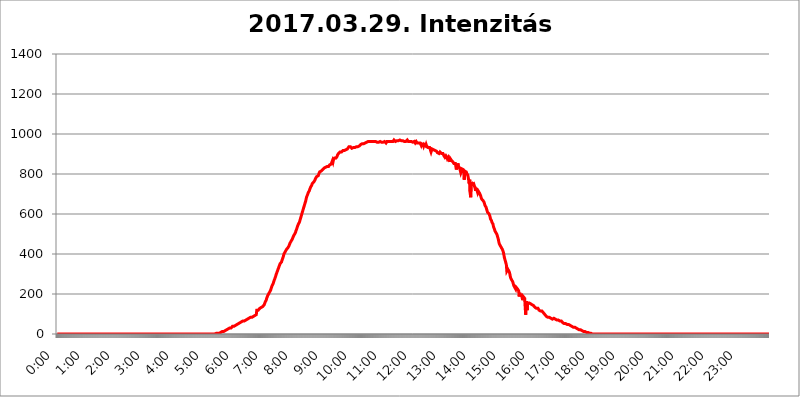
| Category | 2017.03.29. Intenzitás [W/m^2] |
|---|---|
| 0.0 | 0 |
| 0.0006944444444444445 | 0 |
| 0.001388888888888889 | 0 |
| 0.0020833333333333333 | 0 |
| 0.002777777777777778 | 0 |
| 0.003472222222222222 | 0 |
| 0.004166666666666667 | 0 |
| 0.004861111111111111 | 0 |
| 0.005555555555555556 | 0 |
| 0.0062499999999999995 | 0 |
| 0.006944444444444444 | 0 |
| 0.007638888888888889 | 0 |
| 0.008333333333333333 | 0 |
| 0.009027777777777779 | 0 |
| 0.009722222222222222 | 0 |
| 0.010416666666666666 | 0 |
| 0.011111111111111112 | 0 |
| 0.011805555555555555 | 0 |
| 0.012499999999999999 | 0 |
| 0.013194444444444444 | 0 |
| 0.013888888888888888 | 0 |
| 0.014583333333333332 | 0 |
| 0.015277777777777777 | 0 |
| 0.015972222222222224 | 0 |
| 0.016666666666666666 | 0 |
| 0.017361111111111112 | 0 |
| 0.018055555555555557 | 0 |
| 0.01875 | 0 |
| 0.019444444444444445 | 0 |
| 0.02013888888888889 | 0 |
| 0.020833333333333332 | 0 |
| 0.02152777777777778 | 0 |
| 0.022222222222222223 | 0 |
| 0.02291666666666667 | 0 |
| 0.02361111111111111 | 0 |
| 0.024305555555555556 | 0 |
| 0.024999999999999998 | 0 |
| 0.025694444444444447 | 0 |
| 0.02638888888888889 | 0 |
| 0.027083333333333334 | 0 |
| 0.027777777777777776 | 0 |
| 0.02847222222222222 | 0 |
| 0.029166666666666664 | 0 |
| 0.029861111111111113 | 0 |
| 0.030555555555555555 | 0 |
| 0.03125 | 0 |
| 0.03194444444444445 | 0 |
| 0.03263888888888889 | 0 |
| 0.03333333333333333 | 0 |
| 0.034027777777777775 | 0 |
| 0.034722222222222224 | 0 |
| 0.035416666666666666 | 0 |
| 0.036111111111111115 | 0 |
| 0.03680555555555556 | 0 |
| 0.0375 | 0 |
| 0.03819444444444444 | 0 |
| 0.03888888888888889 | 0 |
| 0.03958333333333333 | 0 |
| 0.04027777777777778 | 0 |
| 0.04097222222222222 | 0 |
| 0.041666666666666664 | 0 |
| 0.042361111111111106 | 0 |
| 0.04305555555555556 | 0 |
| 0.043750000000000004 | 0 |
| 0.044444444444444446 | 0 |
| 0.04513888888888889 | 0 |
| 0.04583333333333334 | 0 |
| 0.04652777777777778 | 0 |
| 0.04722222222222222 | 0 |
| 0.04791666666666666 | 0 |
| 0.04861111111111111 | 0 |
| 0.049305555555555554 | 0 |
| 0.049999999999999996 | 0 |
| 0.05069444444444445 | 0 |
| 0.051388888888888894 | 0 |
| 0.052083333333333336 | 0 |
| 0.05277777777777778 | 0 |
| 0.05347222222222222 | 0 |
| 0.05416666666666667 | 0 |
| 0.05486111111111111 | 0 |
| 0.05555555555555555 | 0 |
| 0.05625 | 0 |
| 0.05694444444444444 | 0 |
| 0.057638888888888885 | 0 |
| 0.05833333333333333 | 0 |
| 0.05902777777777778 | 0 |
| 0.059722222222222225 | 0 |
| 0.06041666666666667 | 0 |
| 0.061111111111111116 | 0 |
| 0.06180555555555556 | 0 |
| 0.0625 | 0 |
| 0.06319444444444444 | 0 |
| 0.06388888888888888 | 0 |
| 0.06458333333333334 | 0 |
| 0.06527777777777778 | 0 |
| 0.06597222222222222 | 0 |
| 0.06666666666666667 | 0 |
| 0.06736111111111111 | 0 |
| 0.06805555555555555 | 0 |
| 0.06874999999999999 | 0 |
| 0.06944444444444443 | 0 |
| 0.07013888888888889 | 0 |
| 0.07083333333333333 | 0 |
| 0.07152777777777779 | 0 |
| 0.07222222222222223 | 0 |
| 0.07291666666666667 | 0 |
| 0.07361111111111111 | 0 |
| 0.07430555555555556 | 0 |
| 0.075 | 0 |
| 0.07569444444444444 | 0 |
| 0.0763888888888889 | 0 |
| 0.07708333333333334 | 0 |
| 0.07777777777777778 | 0 |
| 0.07847222222222222 | 0 |
| 0.07916666666666666 | 0 |
| 0.0798611111111111 | 0 |
| 0.08055555555555556 | 0 |
| 0.08125 | 0 |
| 0.08194444444444444 | 0 |
| 0.08263888888888889 | 0 |
| 0.08333333333333333 | 0 |
| 0.08402777777777777 | 0 |
| 0.08472222222222221 | 0 |
| 0.08541666666666665 | 0 |
| 0.08611111111111112 | 0 |
| 0.08680555555555557 | 0 |
| 0.08750000000000001 | 0 |
| 0.08819444444444445 | 0 |
| 0.08888888888888889 | 0 |
| 0.08958333333333333 | 0 |
| 0.09027777777777778 | 0 |
| 0.09097222222222222 | 0 |
| 0.09166666666666667 | 0 |
| 0.09236111111111112 | 0 |
| 0.09305555555555556 | 0 |
| 0.09375 | 0 |
| 0.09444444444444444 | 0 |
| 0.09513888888888888 | 0 |
| 0.09583333333333333 | 0 |
| 0.09652777777777777 | 0 |
| 0.09722222222222222 | 0 |
| 0.09791666666666667 | 0 |
| 0.09861111111111111 | 0 |
| 0.09930555555555555 | 0 |
| 0.09999999999999999 | 0 |
| 0.10069444444444443 | 0 |
| 0.1013888888888889 | 0 |
| 0.10208333333333335 | 0 |
| 0.10277777777777779 | 0 |
| 0.10347222222222223 | 0 |
| 0.10416666666666667 | 0 |
| 0.10486111111111111 | 0 |
| 0.10555555555555556 | 0 |
| 0.10625 | 0 |
| 0.10694444444444444 | 0 |
| 0.1076388888888889 | 0 |
| 0.10833333333333334 | 0 |
| 0.10902777777777778 | 0 |
| 0.10972222222222222 | 0 |
| 0.1111111111111111 | 0 |
| 0.11180555555555556 | 0 |
| 0.11180555555555556 | 0 |
| 0.1125 | 0 |
| 0.11319444444444444 | 0 |
| 0.11388888888888889 | 0 |
| 0.11458333333333333 | 0 |
| 0.11527777777777777 | 0 |
| 0.11597222222222221 | 0 |
| 0.11666666666666665 | 0 |
| 0.1173611111111111 | 0 |
| 0.11805555555555557 | 0 |
| 0.11944444444444445 | 0 |
| 0.12013888888888889 | 0 |
| 0.12083333333333333 | 0 |
| 0.12152777777777778 | 0 |
| 0.12222222222222223 | 0 |
| 0.12291666666666667 | 0 |
| 0.12291666666666667 | 0 |
| 0.12361111111111112 | 0 |
| 0.12430555555555556 | 0 |
| 0.125 | 0 |
| 0.12569444444444444 | 0 |
| 0.12638888888888888 | 0 |
| 0.12708333333333333 | 0 |
| 0.16875 | 0 |
| 0.12847222222222224 | 0 |
| 0.12916666666666668 | 0 |
| 0.12986111111111112 | 0 |
| 0.13055555555555556 | 0 |
| 0.13125 | 0 |
| 0.13194444444444445 | 0 |
| 0.1326388888888889 | 0 |
| 0.13333333333333333 | 0 |
| 0.13402777777777777 | 0 |
| 0.13402777777777777 | 0 |
| 0.13472222222222222 | 0 |
| 0.13541666666666666 | 0 |
| 0.1361111111111111 | 0 |
| 0.13749999999999998 | 0 |
| 0.13819444444444443 | 0 |
| 0.1388888888888889 | 0 |
| 0.13958333333333334 | 0 |
| 0.14027777777777778 | 0 |
| 0.14097222222222222 | 0 |
| 0.14166666666666666 | 0 |
| 0.1423611111111111 | 0 |
| 0.14305555555555557 | 0 |
| 0.14375000000000002 | 0 |
| 0.14444444444444446 | 0 |
| 0.1451388888888889 | 0 |
| 0.1451388888888889 | 0 |
| 0.14652777777777778 | 0 |
| 0.14722222222222223 | 0 |
| 0.14791666666666667 | 0 |
| 0.1486111111111111 | 0 |
| 0.14930555555555555 | 0 |
| 0.15 | 0 |
| 0.15069444444444444 | 0 |
| 0.15138888888888888 | 0 |
| 0.15208333333333332 | 0 |
| 0.15277777777777776 | 0 |
| 0.15347222222222223 | 0 |
| 0.15416666666666667 | 0 |
| 0.15486111111111112 | 0 |
| 0.15555555555555556 | 0 |
| 0.15625 | 0 |
| 0.15694444444444444 | 0 |
| 0.15763888888888888 | 0 |
| 0.15833333333333333 | 0 |
| 0.15902777777777777 | 0 |
| 0.15972222222222224 | 0 |
| 0.16041666666666668 | 0 |
| 0.16111111111111112 | 0 |
| 0.16180555555555556 | 0 |
| 0.1625 | 0 |
| 0.16319444444444445 | 0 |
| 0.1638888888888889 | 0 |
| 0.16458333333333333 | 0 |
| 0.16527777777777777 | 0 |
| 0.16597222222222222 | 0 |
| 0.16666666666666666 | 0 |
| 0.1673611111111111 | 0 |
| 0.16805555555555554 | 0 |
| 0.16874999999999998 | 0 |
| 0.16944444444444443 | 0 |
| 0.17013888888888887 | 0 |
| 0.1708333333333333 | 0 |
| 0.17152777777777775 | 0 |
| 0.17222222222222225 | 0 |
| 0.1729166666666667 | 0 |
| 0.17361111111111113 | 0 |
| 0.17430555555555557 | 0 |
| 0.17500000000000002 | 0 |
| 0.17569444444444446 | 0 |
| 0.1763888888888889 | 0 |
| 0.17708333333333334 | 0 |
| 0.17777777777777778 | 0 |
| 0.17847222222222223 | 0 |
| 0.17916666666666667 | 0 |
| 0.1798611111111111 | 0 |
| 0.18055555555555555 | 0 |
| 0.18125 | 0 |
| 0.18194444444444444 | 0 |
| 0.1826388888888889 | 0 |
| 0.18333333333333335 | 0 |
| 0.1840277777777778 | 0 |
| 0.18472222222222223 | 0 |
| 0.18541666666666667 | 0 |
| 0.18611111111111112 | 0 |
| 0.18680555555555556 | 0 |
| 0.1875 | 0 |
| 0.18819444444444444 | 0 |
| 0.18888888888888888 | 0 |
| 0.18958333333333333 | 0 |
| 0.19027777777777777 | 0 |
| 0.1909722222222222 | 0 |
| 0.19166666666666665 | 0 |
| 0.19236111111111112 | 0 |
| 0.19305555555555554 | 0 |
| 0.19375 | 0 |
| 0.19444444444444445 | 0 |
| 0.1951388888888889 | 0 |
| 0.19583333333333333 | 0 |
| 0.19652777777777777 | 0 |
| 0.19722222222222222 | 0 |
| 0.19791666666666666 | 0 |
| 0.1986111111111111 | 0 |
| 0.19930555555555554 | 0 |
| 0.19999999999999998 | 0 |
| 0.20069444444444443 | 0 |
| 0.20138888888888887 | 0 |
| 0.2020833333333333 | 0 |
| 0.2027777777777778 | 0 |
| 0.2034722222222222 | 0 |
| 0.2041666666666667 | 0 |
| 0.20486111111111113 | 0 |
| 0.20555555555555557 | 0 |
| 0.20625000000000002 | 0 |
| 0.20694444444444446 | 0 |
| 0.2076388888888889 | 0 |
| 0.20833333333333334 | 0 |
| 0.20902777777777778 | 0 |
| 0.20972222222222223 | 0 |
| 0.21041666666666667 | 0 |
| 0.2111111111111111 | 0 |
| 0.21180555555555555 | 0 |
| 0.2125 | 0 |
| 0.21319444444444444 | 0 |
| 0.2138888888888889 | 0 |
| 0.21458333333333335 | 0 |
| 0.2152777777777778 | 0 |
| 0.21597222222222223 | 0 |
| 0.21666666666666667 | 0 |
| 0.21736111111111112 | 0 |
| 0.21805555555555556 | 0 |
| 0.21875 | 0 |
| 0.21944444444444444 | 0 |
| 0.22013888888888888 | 0 |
| 0.22083333333333333 | 0 |
| 0.22152777777777777 | 3.525 |
| 0.2222222222222222 | 3.525 |
| 0.22291666666666665 | 3.525 |
| 0.2236111111111111 | 3.525 |
| 0.22430555555555556 | 3.525 |
| 0.225 | 3.525 |
| 0.22569444444444445 | 3.525 |
| 0.2263888888888889 | 3.525 |
| 0.22708333333333333 | 3.525 |
| 0.22777777777777777 | 7.887 |
| 0.22847222222222222 | 7.887 |
| 0.22916666666666666 | 7.887 |
| 0.2298611111111111 | 7.887 |
| 0.23055555555555554 | 7.887 |
| 0.23124999999999998 | 12.257 |
| 0.23194444444444443 | 12.257 |
| 0.23263888888888887 | 12.257 |
| 0.2333333333333333 | 12.257 |
| 0.2340277777777778 | 16.636 |
| 0.2347222222222222 | 16.636 |
| 0.2354166666666667 | 16.636 |
| 0.23611111111111113 | 21.024 |
| 0.23680555555555557 | 21.024 |
| 0.23750000000000002 | 21.024 |
| 0.23819444444444446 | 21.024 |
| 0.2388888888888889 | 25.419 |
| 0.23958333333333334 | 25.419 |
| 0.24027777777777778 | 25.419 |
| 0.24097222222222223 | 29.823 |
| 0.24166666666666667 | 29.823 |
| 0.2423611111111111 | 29.823 |
| 0.24305555555555555 | 29.823 |
| 0.24375 | 29.823 |
| 0.24444444444444446 | 34.234 |
| 0.24513888888888888 | 34.234 |
| 0.24583333333333335 | 38.653 |
| 0.2465277777777778 | 38.653 |
| 0.24722222222222223 | 38.653 |
| 0.24791666666666667 | 38.653 |
| 0.24861111111111112 | 38.653 |
| 0.24930555555555556 | 43.079 |
| 0.25 | 43.079 |
| 0.25069444444444444 | 43.079 |
| 0.2513888888888889 | 47.511 |
| 0.2520833333333333 | 47.511 |
| 0.25277777777777777 | 47.511 |
| 0.2534722222222222 | 47.511 |
| 0.25416666666666665 | 51.951 |
| 0.2548611111111111 | 51.951 |
| 0.2555555555555556 | 51.951 |
| 0.25625000000000003 | 56.398 |
| 0.2569444444444445 | 56.398 |
| 0.2576388888888889 | 56.398 |
| 0.25833333333333336 | 60.85 |
| 0.2590277777777778 | 60.85 |
| 0.25972222222222224 | 60.85 |
| 0.2604166666666667 | 65.31 |
| 0.2611111111111111 | 65.31 |
| 0.26180555555555557 | 65.31 |
| 0.2625 | 65.31 |
| 0.26319444444444445 | 69.775 |
| 0.2638888888888889 | 69.775 |
| 0.26458333333333334 | 69.775 |
| 0.2652777777777778 | 69.775 |
| 0.2659722222222222 | 74.246 |
| 0.26666666666666666 | 74.246 |
| 0.2673611111111111 | 74.246 |
| 0.26805555555555555 | 74.246 |
| 0.26875 | 78.722 |
| 0.26944444444444443 | 78.722 |
| 0.2701388888888889 | 83.205 |
| 0.2708333333333333 | 83.205 |
| 0.27152777777777776 | 83.205 |
| 0.2722222222222222 | 83.205 |
| 0.27291666666666664 | 83.205 |
| 0.2736111111111111 | 87.692 |
| 0.2743055555555555 | 87.692 |
| 0.27499999999999997 | 87.692 |
| 0.27569444444444446 | 87.692 |
| 0.27638888888888885 | 92.184 |
| 0.27708333333333335 | 92.184 |
| 0.2777777777777778 | 92.184 |
| 0.27847222222222223 | 92.184 |
| 0.2791666666666667 | 96.682 |
| 0.2798611111111111 | 119.235 |
| 0.28055555555555556 | 119.235 |
| 0.28125 | 119.235 |
| 0.28194444444444444 | 119.235 |
| 0.2826388888888889 | 123.758 |
| 0.2833333333333333 | 123.758 |
| 0.28402777777777777 | 128.284 |
| 0.2847222222222222 | 128.284 |
| 0.28541666666666665 | 128.284 |
| 0.28611111111111115 | 132.814 |
| 0.28680555555555554 | 132.814 |
| 0.28750000000000003 | 132.814 |
| 0.2881944444444445 | 137.347 |
| 0.2888888888888889 | 141.884 |
| 0.28958333333333336 | 141.884 |
| 0.2902777777777778 | 146.423 |
| 0.29097222222222224 | 150.964 |
| 0.2916666666666667 | 160.056 |
| 0.2923611111111111 | 164.605 |
| 0.29305555555555557 | 169.156 |
| 0.29375 | 178.264 |
| 0.29444444444444445 | 182.82 |
| 0.2951388888888889 | 191.937 |
| 0.29583333333333334 | 196.497 |
| 0.2965277777777778 | 201.058 |
| 0.2972222222222222 | 201.058 |
| 0.29791666666666666 | 210.182 |
| 0.2986111111111111 | 214.746 |
| 0.29930555555555555 | 219.309 |
| 0.3 | 228.436 |
| 0.30069444444444443 | 233 |
| 0.3013888888888889 | 242.127 |
| 0.3020833333333333 | 246.689 |
| 0.30277777777777776 | 251.251 |
| 0.3034722222222222 | 260.373 |
| 0.30416666666666664 | 264.932 |
| 0.3048611111111111 | 274.047 |
| 0.3055555555555555 | 278.603 |
| 0.30624999999999997 | 287.709 |
| 0.3069444444444444 | 296.808 |
| 0.3076388888888889 | 301.354 |
| 0.30833333333333335 | 310.44 |
| 0.3090277777777778 | 314.98 |
| 0.30972222222222223 | 324.052 |
| 0.3104166666666667 | 328.584 |
| 0.3111111111111111 | 337.639 |
| 0.31180555555555556 | 342.162 |
| 0.3125 | 351.198 |
| 0.31319444444444444 | 355.712 |
| 0.3138888888888889 | 355.712 |
| 0.3145833333333333 | 360.221 |
| 0.31527777777777777 | 369.23 |
| 0.3159722222222222 | 373.729 |
| 0.31666666666666665 | 382.715 |
| 0.31736111111111115 | 391.685 |
| 0.31805555555555554 | 400.638 |
| 0.31875000000000003 | 400.638 |
| 0.3194444444444445 | 409.574 |
| 0.3201388888888889 | 414.035 |
| 0.32083333333333336 | 414.035 |
| 0.3215277777777778 | 422.943 |
| 0.32222222222222224 | 422.943 |
| 0.3229166666666667 | 427.39 |
| 0.3236111111111111 | 431.833 |
| 0.32430555555555557 | 431.833 |
| 0.325 | 440.702 |
| 0.32569444444444445 | 445.129 |
| 0.3263888888888889 | 453.968 |
| 0.32708333333333334 | 458.38 |
| 0.3277777777777778 | 462.786 |
| 0.3284722222222222 | 462.786 |
| 0.32916666666666666 | 467.187 |
| 0.3298611111111111 | 475.972 |
| 0.33055555555555555 | 480.356 |
| 0.33125 | 489.108 |
| 0.33194444444444443 | 493.475 |
| 0.3326388888888889 | 497.836 |
| 0.3333333333333333 | 502.192 |
| 0.3340277777777778 | 506.542 |
| 0.3347222222222222 | 515.223 |
| 0.3354166666666667 | 519.555 |
| 0.3361111111111111 | 528.2 |
| 0.3368055555555556 | 536.82 |
| 0.33749999999999997 | 541.121 |
| 0.33819444444444446 | 549.704 |
| 0.33888888888888885 | 553.986 |
| 0.33958333333333335 | 558.261 |
| 0.34027777777777773 | 566.793 |
| 0.34097222222222223 | 575.299 |
| 0.3416666666666666 | 583.779 |
| 0.3423611111111111 | 592.233 |
| 0.3430555555555555 | 600.661 |
| 0.34375 | 609.062 |
| 0.3444444444444445 | 617.436 |
| 0.3451388888888889 | 625.784 |
| 0.3458333333333334 | 634.105 |
| 0.34652777777777777 | 642.4 |
| 0.34722222222222227 | 650.667 |
| 0.34791666666666665 | 658.909 |
| 0.34861111111111115 | 667.123 |
| 0.34930555555555554 | 679.395 |
| 0.35000000000000003 | 687.544 |
| 0.3506944444444444 | 691.608 |
| 0.3513888888888889 | 699.717 |
| 0.3520833333333333 | 707.8 |
| 0.3527777777777778 | 711.832 |
| 0.3534722222222222 | 715.858 |
| 0.3541666666666667 | 723.889 |
| 0.3548611111111111 | 727.896 |
| 0.35555555555555557 | 735.89 |
| 0.35625 | 735.89 |
| 0.35694444444444445 | 743.859 |
| 0.3576388888888889 | 751.803 |
| 0.35833333333333334 | 755.766 |
| 0.3590277777777778 | 755.766 |
| 0.3597222222222222 | 759.723 |
| 0.36041666666666666 | 763.674 |
| 0.3611111111111111 | 767.62 |
| 0.36180555555555555 | 771.559 |
| 0.3625 | 779.42 |
| 0.36319444444444443 | 783.342 |
| 0.3638888888888889 | 787.258 |
| 0.3645833333333333 | 791.169 |
| 0.3652777777777778 | 787.258 |
| 0.3659722222222222 | 791.169 |
| 0.3666666666666667 | 798.974 |
| 0.3673611111111111 | 802.868 |
| 0.3680555555555556 | 810.641 |
| 0.36874999999999997 | 806.757 |
| 0.36944444444444446 | 814.519 |
| 0.37013888888888885 | 814.519 |
| 0.37083333333333335 | 818.392 |
| 0.37152777777777773 | 818.392 |
| 0.37222222222222223 | 822.26 |
| 0.3729166666666666 | 826.123 |
| 0.3736111111111111 | 826.123 |
| 0.3743055555555555 | 829.981 |
| 0.375 | 833.834 |
| 0.3756944444444445 | 833.834 |
| 0.3763888888888889 | 833.834 |
| 0.3770833333333334 | 833.834 |
| 0.37777777777777777 | 837.682 |
| 0.37847222222222227 | 837.682 |
| 0.37916666666666665 | 841.526 |
| 0.37986111111111115 | 837.682 |
| 0.38055555555555554 | 837.682 |
| 0.38125000000000003 | 837.682 |
| 0.3819444444444444 | 845.365 |
| 0.3826388888888889 | 845.365 |
| 0.3833333333333333 | 845.365 |
| 0.3840277777777778 | 849.199 |
| 0.3847222222222222 | 853.029 |
| 0.3854166666666667 | 853.029 |
| 0.3861111111111111 | 868.305 |
| 0.38680555555555557 | 860.676 |
| 0.3875 | 872.114 |
| 0.38819444444444445 | 875.918 |
| 0.3888888888888889 | 879.719 |
| 0.38958333333333334 | 875.918 |
| 0.3902777777777778 | 883.516 |
| 0.3909722222222222 | 879.719 |
| 0.39166666666666666 | 875.918 |
| 0.3923611111111111 | 887.309 |
| 0.39305555555555555 | 894.885 |
| 0.39375 | 898.668 |
| 0.39444444444444443 | 902.447 |
| 0.3951388888888889 | 902.447 |
| 0.3958333333333333 | 906.223 |
| 0.3965277777777778 | 909.996 |
| 0.3972222222222222 | 909.996 |
| 0.3979166666666667 | 909.996 |
| 0.3986111111111111 | 909.996 |
| 0.3993055555555556 | 909.996 |
| 0.39999999999999997 | 913.766 |
| 0.40069444444444446 | 917.534 |
| 0.40138888888888885 | 917.534 |
| 0.40208333333333335 | 917.534 |
| 0.40277777777777773 | 917.534 |
| 0.40347222222222223 | 917.534 |
| 0.4041666666666666 | 913.766 |
| 0.4048611111111111 | 921.298 |
| 0.4055555555555555 | 917.534 |
| 0.40625 | 925.06 |
| 0.4069444444444445 | 925.06 |
| 0.4076388888888889 | 925.06 |
| 0.4083333333333334 | 925.06 |
| 0.40902777777777777 | 936.33 |
| 0.40972222222222227 | 936.33 |
| 0.41041666666666665 | 936.33 |
| 0.41111111111111115 | 936.33 |
| 0.41180555555555554 | 932.576 |
| 0.41250000000000003 | 932.576 |
| 0.4131944444444444 | 928.819 |
| 0.4138888888888889 | 928.819 |
| 0.4145833333333333 | 932.576 |
| 0.4152777777777778 | 932.576 |
| 0.4159722222222222 | 932.576 |
| 0.4166666666666667 | 932.576 |
| 0.4173611111111111 | 932.576 |
| 0.41805555555555557 | 932.576 |
| 0.41875 | 932.576 |
| 0.41944444444444445 | 936.33 |
| 0.4201388888888889 | 936.33 |
| 0.42083333333333334 | 936.33 |
| 0.4215277777777778 | 936.33 |
| 0.4222222222222222 | 940.082 |
| 0.42291666666666666 | 940.082 |
| 0.4236111111111111 | 940.082 |
| 0.42430555555555555 | 943.832 |
| 0.425 | 943.832 |
| 0.42569444444444443 | 947.58 |
| 0.4263888888888889 | 947.58 |
| 0.4270833333333333 | 951.327 |
| 0.4277777777777778 | 951.327 |
| 0.4284722222222222 | 947.58 |
| 0.4291666666666667 | 951.327 |
| 0.4298611111111111 | 951.327 |
| 0.4305555555555556 | 955.071 |
| 0.43124999999999997 | 955.071 |
| 0.43194444444444446 | 955.071 |
| 0.43263888888888885 | 958.814 |
| 0.43333333333333335 | 955.071 |
| 0.43402777777777773 | 958.814 |
| 0.43472222222222223 | 955.071 |
| 0.4354166666666666 | 958.814 |
| 0.4361111111111111 | 962.555 |
| 0.4368055555555555 | 962.555 |
| 0.4375 | 962.555 |
| 0.4381944444444445 | 962.555 |
| 0.4388888888888889 | 962.555 |
| 0.4395833333333334 | 962.555 |
| 0.44027777777777777 | 962.555 |
| 0.44097222222222227 | 962.555 |
| 0.44166666666666665 | 962.555 |
| 0.44236111111111115 | 962.555 |
| 0.44305555555555554 | 966.295 |
| 0.44375000000000003 | 962.555 |
| 0.4444444444444444 | 962.555 |
| 0.4451388888888889 | 962.555 |
| 0.4458333333333333 | 962.555 |
| 0.4465277777777778 | 962.555 |
| 0.4472222222222222 | 962.555 |
| 0.4479166666666667 | 962.555 |
| 0.4486111111111111 | 958.814 |
| 0.44930555555555557 | 962.555 |
| 0.45 | 962.555 |
| 0.45069444444444445 | 958.814 |
| 0.4513888888888889 | 962.555 |
| 0.45208333333333334 | 962.555 |
| 0.4527777777777778 | 962.555 |
| 0.4534722222222222 | 962.555 |
| 0.45416666666666666 | 958.814 |
| 0.4548611111111111 | 958.814 |
| 0.45555555555555555 | 962.555 |
| 0.45625 | 962.555 |
| 0.45694444444444443 | 958.814 |
| 0.4576388888888889 | 958.814 |
| 0.4583333333333333 | 958.814 |
| 0.4590277777777778 | 962.555 |
| 0.4597222222222222 | 958.814 |
| 0.4604166666666667 | 958.814 |
| 0.4611111111111111 | 955.071 |
| 0.4618055555555556 | 958.814 |
| 0.46249999999999997 | 962.555 |
| 0.46319444444444446 | 962.555 |
| 0.46388888888888885 | 962.555 |
| 0.46458333333333335 | 962.555 |
| 0.46527777777777773 | 962.555 |
| 0.46597222222222223 | 962.555 |
| 0.4666666666666666 | 962.555 |
| 0.4673611111111111 | 958.814 |
| 0.4680555555555555 | 966.295 |
| 0.46875 | 962.555 |
| 0.4694444444444445 | 966.295 |
| 0.4701388888888889 | 962.555 |
| 0.4708333333333334 | 962.555 |
| 0.47152777777777777 | 966.295 |
| 0.47222222222222227 | 970.034 |
| 0.47291666666666665 | 970.034 |
| 0.47361111111111115 | 966.295 |
| 0.47430555555555554 | 962.555 |
| 0.47500000000000003 | 966.295 |
| 0.4756944444444444 | 962.555 |
| 0.4763888888888889 | 966.295 |
| 0.4770833333333333 | 966.295 |
| 0.4777777777777778 | 966.295 |
| 0.4784722222222222 | 966.295 |
| 0.4791666666666667 | 966.295 |
| 0.4798611111111111 | 970.034 |
| 0.48055555555555557 | 970.034 |
| 0.48125 | 966.295 |
| 0.48194444444444445 | 966.295 |
| 0.4826388888888889 | 966.295 |
| 0.48333333333333334 | 966.295 |
| 0.4840277777777778 | 962.555 |
| 0.4847222222222222 | 966.295 |
| 0.48541666666666666 | 966.295 |
| 0.4861111111111111 | 966.295 |
| 0.48680555555555555 | 962.555 |
| 0.4875 | 962.555 |
| 0.48819444444444443 | 958.814 |
| 0.4888888888888889 | 962.555 |
| 0.4895833333333333 | 962.555 |
| 0.4902777777777778 | 962.555 |
| 0.4909722222222222 | 970.034 |
| 0.4916666666666667 | 970.034 |
| 0.4923611111111111 | 962.555 |
| 0.4930555555555556 | 962.555 |
| 0.49374999999999997 | 962.555 |
| 0.49444444444444446 | 962.555 |
| 0.49513888888888885 | 966.295 |
| 0.49583333333333335 | 962.555 |
| 0.49652777777777773 | 962.555 |
| 0.49722222222222223 | 962.555 |
| 0.4979166666666666 | 958.814 |
| 0.4986111111111111 | 958.814 |
| 0.4993055555555555 | 962.555 |
| 0.5 | 962.555 |
| 0.5006944444444444 | 962.555 |
| 0.5013888888888889 | 958.814 |
| 0.5020833333333333 | 955.071 |
| 0.5027777777777778 | 958.814 |
| 0.5034722222222222 | 962.555 |
| 0.5041666666666667 | 958.814 |
| 0.5048611111111111 | 955.071 |
| 0.5055555555555555 | 951.327 |
| 0.50625 | 955.071 |
| 0.5069444444444444 | 955.071 |
| 0.5076388888888889 | 951.327 |
| 0.5083333333333333 | 951.327 |
| 0.5090277777777777 | 955.071 |
| 0.5097222222222222 | 951.327 |
| 0.5104166666666666 | 943.832 |
| 0.5111111111111112 | 951.327 |
| 0.5118055555555555 | 947.58 |
| 0.5125000000000001 | 947.58 |
| 0.5131944444444444 | 947.58 |
| 0.513888888888889 | 940.082 |
| 0.5145833333333333 | 947.58 |
| 0.5152777777777778 | 947.58 |
| 0.5159722222222222 | 943.832 |
| 0.5166666666666667 | 940.082 |
| 0.517361111111111 | 947.58 |
| 0.5180555555555556 | 940.082 |
| 0.5187499999999999 | 940.082 |
| 0.5194444444444445 | 940.082 |
| 0.5201388888888888 | 932.576 |
| 0.5208333333333334 | 932.576 |
| 0.5215277777777778 | 936.33 |
| 0.5222222222222223 | 932.576 |
| 0.5229166666666667 | 932.576 |
| 0.5236111111111111 | 932.576 |
| 0.5243055555555556 | 909.996 |
| 0.525 | 917.534 |
| 0.5256944444444445 | 925.06 |
| 0.5263888888888889 | 925.06 |
| 0.5270833333333333 | 925.06 |
| 0.5277777777777778 | 921.298 |
| 0.5284722222222222 | 921.298 |
| 0.5291666666666667 | 917.534 |
| 0.5298611111111111 | 917.534 |
| 0.5305555555555556 | 917.534 |
| 0.53125 | 913.766 |
| 0.5319444444444444 | 913.766 |
| 0.5326388888888889 | 909.996 |
| 0.5333333333333333 | 906.223 |
| 0.5340277777777778 | 909.996 |
| 0.5347222222222222 | 909.996 |
| 0.5354166666666667 | 902.447 |
| 0.5361111111111111 | 906.223 |
| 0.5368055555555555 | 909.996 |
| 0.5375 | 909.996 |
| 0.5381944444444444 | 906.223 |
| 0.5388888888888889 | 902.447 |
| 0.5395833333333333 | 902.447 |
| 0.5402777777777777 | 898.668 |
| 0.5409722222222222 | 902.447 |
| 0.5416666666666666 | 898.668 |
| 0.5423611111111112 | 891.099 |
| 0.5430555555555555 | 887.309 |
| 0.5437500000000001 | 883.516 |
| 0.5444444444444444 | 883.516 |
| 0.545138888888889 | 891.099 |
| 0.5458333333333333 | 887.309 |
| 0.5465277777777778 | 883.516 |
| 0.5472222222222222 | 875.918 |
| 0.5479166666666667 | 872.114 |
| 0.548611111111111 | 883.516 |
| 0.5493055555555556 | 875.918 |
| 0.5499999999999999 | 868.305 |
| 0.5506944444444445 | 860.676 |
| 0.5513888888888888 | 875.918 |
| 0.5520833333333334 | 872.114 |
| 0.5527777777777778 | 868.305 |
| 0.5534722222222223 | 868.305 |
| 0.5541666666666667 | 864.493 |
| 0.5548611111111111 | 860.676 |
| 0.5555555555555556 | 856.855 |
| 0.55625 | 853.029 |
| 0.5569444444444445 | 849.199 |
| 0.5576388888888889 | 849.199 |
| 0.5583333333333333 | 853.029 |
| 0.5590277777777778 | 853.029 |
| 0.5597222222222222 | 822.26 |
| 0.5604166666666667 | 833.834 |
| 0.5611111111111111 | 841.526 |
| 0.5618055555555556 | 853.029 |
| 0.5625 | 841.526 |
| 0.5631944444444444 | 837.682 |
| 0.5638888888888889 | 837.682 |
| 0.5645833333333333 | 826.123 |
| 0.5652777777777778 | 826.123 |
| 0.5659722222222222 | 806.757 |
| 0.5666666666666667 | 814.519 |
| 0.5673611111111111 | 826.123 |
| 0.5680555555555555 | 826.123 |
| 0.56875 | 826.123 |
| 0.5694444444444444 | 822.26 |
| 0.5701388888888889 | 814.519 |
| 0.5708333333333333 | 771.559 |
| 0.5715277777777777 | 814.519 |
| 0.5722222222222222 | 814.519 |
| 0.5729166666666666 | 814.519 |
| 0.5736111111111112 | 810.641 |
| 0.5743055555555555 | 802.868 |
| 0.5750000000000001 | 798.974 |
| 0.5756944444444444 | 795.074 |
| 0.576388888888889 | 783.342 |
| 0.5770833333333333 | 779.42 |
| 0.5777777777777778 | 751.803 |
| 0.5784722222222222 | 771.559 |
| 0.5791666666666667 | 703.762 |
| 0.579861111111111 | 683.473 |
| 0.5805555555555556 | 759.723 |
| 0.5812499999999999 | 755.766 |
| 0.5819444444444445 | 747.834 |
| 0.5826388888888888 | 751.803 |
| 0.5833333333333334 | 747.834 |
| 0.5840277777777778 | 751.803 |
| 0.5847222222222223 | 751.803 |
| 0.5854166666666667 | 735.89 |
| 0.5861111111111111 | 727.896 |
| 0.5868055555555556 | 715.858 |
| 0.5875 | 723.889 |
| 0.5881944444444445 | 719.877 |
| 0.5888888888888889 | 715.858 |
| 0.5895833333333333 | 707.8 |
| 0.5902777777777778 | 715.858 |
| 0.5909722222222222 | 715.858 |
| 0.5916666666666667 | 711.832 |
| 0.5923611111111111 | 703.762 |
| 0.5930555555555556 | 699.717 |
| 0.59375 | 691.608 |
| 0.5944444444444444 | 683.473 |
| 0.5951388888888889 | 675.311 |
| 0.5958333333333333 | 675.311 |
| 0.5965277777777778 | 671.22 |
| 0.5972222222222222 | 667.123 |
| 0.5979166666666667 | 663.019 |
| 0.5986111111111111 | 658.909 |
| 0.5993055555555555 | 650.667 |
| 0.6 | 642.4 |
| 0.6006944444444444 | 638.256 |
| 0.6013888888888889 | 634.105 |
| 0.6020833333333333 | 625.784 |
| 0.6027777777777777 | 621.613 |
| 0.6034722222222222 | 609.062 |
| 0.6041666666666666 | 604.864 |
| 0.6048611111111112 | 604.864 |
| 0.6055555555555555 | 600.661 |
| 0.6062500000000001 | 596.45 |
| 0.6069444444444444 | 588.009 |
| 0.607638888888889 | 575.299 |
| 0.6083333333333333 | 571.049 |
| 0.6090277777777778 | 566.793 |
| 0.6097222222222222 | 558.261 |
| 0.6104166666666667 | 558.261 |
| 0.611111111111111 | 549.704 |
| 0.6118055555555556 | 536.82 |
| 0.6124999999999999 | 532.513 |
| 0.6131944444444445 | 523.88 |
| 0.6138888888888888 | 515.223 |
| 0.6145833333333334 | 510.885 |
| 0.6152777777777778 | 506.542 |
| 0.6159722222222223 | 502.192 |
| 0.6166666666666667 | 497.836 |
| 0.6173611111111111 | 489.108 |
| 0.6180555555555556 | 480.356 |
| 0.61875 | 471.582 |
| 0.6194444444444445 | 458.38 |
| 0.6201388888888889 | 449.551 |
| 0.6208333333333333 | 445.129 |
| 0.6215277777777778 | 440.702 |
| 0.6222222222222222 | 436.27 |
| 0.6229166666666667 | 431.833 |
| 0.6236111111111111 | 427.39 |
| 0.6243055555555556 | 422.943 |
| 0.625 | 418.492 |
| 0.6256944444444444 | 409.574 |
| 0.6263888888888889 | 396.164 |
| 0.6270833333333333 | 382.715 |
| 0.6277777777777778 | 373.729 |
| 0.6284722222222222 | 364.728 |
| 0.6291666666666667 | 355.712 |
| 0.6298611111111111 | 346.682 |
| 0.6305555555555555 | 314.98 |
| 0.63125 | 319.517 |
| 0.6319444444444444 | 324.052 |
| 0.6326388888888889 | 319.517 |
| 0.6333333333333333 | 319.517 |
| 0.6340277777777777 | 310.44 |
| 0.6347222222222222 | 301.354 |
| 0.6354166666666666 | 287.709 |
| 0.6361111111111112 | 278.603 |
| 0.6368055555555555 | 274.047 |
| 0.6375000000000001 | 269.49 |
| 0.6381944444444444 | 264.932 |
| 0.638888888888889 | 260.373 |
| 0.6395833333333333 | 255.813 |
| 0.6402777777777778 | 242.127 |
| 0.6409722222222222 | 237.564 |
| 0.6416666666666667 | 233 |
| 0.642361111111111 | 233 |
| 0.6430555555555556 | 223.873 |
| 0.6437499999999999 | 233 |
| 0.6444444444444445 | 233 |
| 0.6451388888888888 | 228.436 |
| 0.6458333333333334 | 223.873 |
| 0.6465277777777778 | 219.309 |
| 0.6472222222222223 | 214.746 |
| 0.6479166666666667 | 187.378 |
| 0.6486111111111111 | 205.62 |
| 0.6493055555555556 | 196.497 |
| 0.65 | 191.937 |
| 0.6506944444444445 | 191.937 |
| 0.6513888888888889 | 191.937 |
| 0.6520833333333333 | 191.937 |
| 0.6527777777777778 | 169.156 |
| 0.6534722222222222 | 187.378 |
| 0.6541666666666667 | 187.378 |
| 0.6548611111111111 | 182.82 |
| 0.6555555555555556 | 178.264 |
| 0.65625 | 173.709 |
| 0.6569444444444444 | 96.682 |
| 0.6576388888888889 | 164.605 |
| 0.6583333333333333 | 160.056 |
| 0.6590277777777778 | 119.235 |
| 0.6597222222222222 | 155.509 |
| 0.6604166666666667 | 150.964 |
| 0.6611111111111111 | 155.509 |
| 0.6618055555555555 | 155.509 |
| 0.6625 | 150.964 |
| 0.6631944444444444 | 150.964 |
| 0.6638888888888889 | 150.964 |
| 0.6645833333333333 | 146.423 |
| 0.6652777777777777 | 146.423 |
| 0.6659722222222222 | 146.423 |
| 0.6666666666666666 | 141.884 |
| 0.6673611111111111 | 141.884 |
| 0.6680555555555556 | 141.884 |
| 0.6687500000000001 | 137.347 |
| 0.6694444444444444 | 137.347 |
| 0.6701388888888888 | 132.814 |
| 0.6708333333333334 | 132.814 |
| 0.6715277777777778 | 128.284 |
| 0.6722222222222222 | 128.284 |
| 0.6729166666666666 | 128.284 |
| 0.6736111111111112 | 128.284 |
| 0.6743055555555556 | 128.284 |
| 0.6749999999999999 | 123.758 |
| 0.6756944444444444 | 119.235 |
| 0.6763888888888889 | 119.235 |
| 0.6770833333333334 | 114.716 |
| 0.6777777777777777 | 114.716 |
| 0.6784722222222223 | 114.716 |
| 0.6791666666666667 | 114.716 |
| 0.6798611111111111 | 114.716 |
| 0.6805555555555555 | 114.716 |
| 0.68125 | 110.201 |
| 0.6819444444444445 | 105.69 |
| 0.6826388888888889 | 105.69 |
| 0.6833333333333332 | 101.184 |
| 0.6840277777777778 | 96.682 |
| 0.6847222222222222 | 92.184 |
| 0.6854166666666667 | 92.184 |
| 0.686111111111111 | 87.692 |
| 0.6868055555555556 | 87.692 |
| 0.6875 | 83.205 |
| 0.6881944444444444 | 83.205 |
| 0.688888888888889 | 83.205 |
| 0.6895833333333333 | 83.205 |
| 0.6902777777777778 | 83.205 |
| 0.6909722222222222 | 78.722 |
| 0.6916666666666668 | 83.205 |
| 0.6923611111111111 | 78.722 |
| 0.6930555555555555 | 78.722 |
| 0.69375 | 74.246 |
| 0.6944444444444445 | 74.246 |
| 0.6951388888888889 | 78.722 |
| 0.6958333333333333 | 78.722 |
| 0.6965277777777777 | 78.722 |
| 0.6972222222222223 | 78.722 |
| 0.6979166666666666 | 74.246 |
| 0.6986111111111111 | 74.246 |
| 0.6993055555555556 | 74.246 |
| 0.7000000000000001 | 74.246 |
| 0.7006944444444444 | 69.775 |
| 0.7013888888888888 | 74.246 |
| 0.7020833333333334 | 69.775 |
| 0.7027777777777778 | 69.775 |
| 0.7034722222222222 | 69.775 |
| 0.7041666666666666 | 69.775 |
| 0.7048611111111112 | 65.31 |
| 0.7055555555555556 | 65.31 |
| 0.7062499999999999 | 65.31 |
| 0.7069444444444444 | 65.31 |
| 0.7076388888888889 | 60.85 |
| 0.7083333333333334 | 60.85 |
| 0.7090277777777777 | 56.398 |
| 0.7097222222222223 | 51.951 |
| 0.7104166666666667 | 51.951 |
| 0.7111111111111111 | 51.951 |
| 0.7118055555555555 | 51.951 |
| 0.7125 | 51.951 |
| 0.7131944444444445 | 51.951 |
| 0.7138888888888889 | 51.951 |
| 0.7145833333333332 | 51.951 |
| 0.7152777777777778 | 47.511 |
| 0.7159722222222222 | 47.511 |
| 0.7166666666666667 | 47.511 |
| 0.717361111111111 | 47.511 |
| 0.7180555555555556 | 47.511 |
| 0.71875 | 43.079 |
| 0.7194444444444444 | 43.079 |
| 0.720138888888889 | 43.079 |
| 0.7208333333333333 | 38.653 |
| 0.7215277777777778 | 38.653 |
| 0.7222222222222222 | 38.653 |
| 0.7229166666666668 | 34.234 |
| 0.7236111111111111 | 34.234 |
| 0.7243055555555555 | 34.234 |
| 0.725 | 34.234 |
| 0.7256944444444445 | 34.234 |
| 0.7263888888888889 | 29.823 |
| 0.7270833333333333 | 29.823 |
| 0.7277777777777777 | 29.823 |
| 0.7284722222222223 | 29.823 |
| 0.7291666666666666 | 25.419 |
| 0.7298611111111111 | 25.419 |
| 0.7305555555555556 | 25.419 |
| 0.7312500000000001 | 25.419 |
| 0.7319444444444444 | 21.024 |
| 0.7326388888888888 | 21.024 |
| 0.7333333333333334 | 21.024 |
| 0.7340277777777778 | 21.024 |
| 0.7347222222222222 | 21.024 |
| 0.7354166666666666 | 21.024 |
| 0.7361111111111112 | 16.636 |
| 0.7368055555555556 | 16.636 |
| 0.7374999999999999 | 16.636 |
| 0.7381944444444444 | 12.257 |
| 0.7388888888888889 | 12.257 |
| 0.7395833333333334 | 12.257 |
| 0.7402777777777777 | 12.257 |
| 0.7409722222222223 | 12.257 |
| 0.7416666666666667 | 12.257 |
| 0.7423611111111111 | 7.887 |
| 0.7430555555555555 | 7.887 |
| 0.74375 | 7.887 |
| 0.7444444444444445 | 7.887 |
| 0.7451388888888889 | 3.525 |
| 0.7458333333333332 | 3.525 |
| 0.7465277777777778 | 3.525 |
| 0.7472222222222222 | 3.525 |
| 0.7479166666666667 | 3.525 |
| 0.748611111111111 | 3.525 |
| 0.7493055555555556 | 3.525 |
| 0.75 | 0 |
| 0.7506944444444444 | 0 |
| 0.751388888888889 | 0 |
| 0.7520833333333333 | 0 |
| 0.7527777777777778 | 0 |
| 0.7534722222222222 | 0 |
| 0.7541666666666668 | 0 |
| 0.7548611111111111 | 0 |
| 0.7555555555555555 | 0 |
| 0.75625 | 0 |
| 0.7569444444444445 | 0 |
| 0.7576388888888889 | 0 |
| 0.7583333333333333 | 0 |
| 0.7590277777777777 | 0 |
| 0.7597222222222223 | 0 |
| 0.7604166666666666 | 0 |
| 0.7611111111111111 | 0 |
| 0.7618055555555556 | 0 |
| 0.7625000000000001 | 0 |
| 0.7631944444444444 | 0 |
| 0.7638888888888888 | 0 |
| 0.7645833333333334 | 0 |
| 0.7652777777777778 | 0 |
| 0.7659722222222222 | 0 |
| 0.7666666666666666 | 0 |
| 0.7673611111111112 | 0 |
| 0.7680555555555556 | 0 |
| 0.7687499999999999 | 0 |
| 0.7694444444444444 | 0 |
| 0.7701388888888889 | 0 |
| 0.7708333333333334 | 0 |
| 0.7715277777777777 | 0 |
| 0.7722222222222223 | 0 |
| 0.7729166666666667 | 0 |
| 0.7736111111111111 | 0 |
| 0.7743055555555555 | 0 |
| 0.775 | 0 |
| 0.7756944444444445 | 0 |
| 0.7763888888888889 | 0 |
| 0.7770833333333332 | 0 |
| 0.7777777777777778 | 0 |
| 0.7784722222222222 | 0 |
| 0.7791666666666667 | 0 |
| 0.779861111111111 | 0 |
| 0.7805555555555556 | 0 |
| 0.78125 | 0 |
| 0.7819444444444444 | 0 |
| 0.782638888888889 | 0 |
| 0.7833333333333333 | 0 |
| 0.7840277777777778 | 0 |
| 0.7847222222222222 | 0 |
| 0.7854166666666668 | 0 |
| 0.7861111111111111 | 0 |
| 0.7868055555555555 | 0 |
| 0.7875 | 0 |
| 0.7881944444444445 | 0 |
| 0.7888888888888889 | 0 |
| 0.7895833333333333 | 0 |
| 0.7902777777777777 | 0 |
| 0.7909722222222223 | 0 |
| 0.7916666666666666 | 0 |
| 0.7923611111111111 | 0 |
| 0.7930555555555556 | 0 |
| 0.7937500000000001 | 0 |
| 0.7944444444444444 | 0 |
| 0.7951388888888888 | 0 |
| 0.7958333333333334 | 0 |
| 0.7965277777777778 | 0 |
| 0.7972222222222222 | 0 |
| 0.7979166666666666 | 0 |
| 0.7986111111111112 | 0 |
| 0.7993055555555556 | 0 |
| 0.7999999999999999 | 0 |
| 0.8006944444444444 | 0 |
| 0.8013888888888889 | 0 |
| 0.8020833333333334 | 0 |
| 0.8027777777777777 | 0 |
| 0.8034722222222223 | 0 |
| 0.8041666666666667 | 0 |
| 0.8048611111111111 | 0 |
| 0.8055555555555555 | 0 |
| 0.80625 | 0 |
| 0.8069444444444445 | 0 |
| 0.8076388888888889 | 0 |
| 0.8083333333333332 | 0 |
| 0.8090277777777778 | 0 |
| 0.8097222222222222 | 0 |
| 0.8104166666666667 | 0 |
| 0.811111111111111 | 0 |
| 0.8118055555555556 | 0 |
| 0.8125 | 0 |
| 0.8131944444444444 | 0 |
| 0.813888888888889 | 0 |
| 0.8145833333333333 | 0 |
| 0.8152777777777778 | 0 |
| 0.8159722222222222 | 0 |
| 0.8166666666666668 | 0 |
| 0.8173611111111111 | 0 |
| 0.8180555555555555 | 0 |
| 0.81875 | 0 |
| 0.8194444444444445 | 0 |
| 0.8201388888888889 | 0 |
| 0.8208333333333333 | 0 |
| 0.8215277777777777 | 0 |
| 0.8222222222222223 | 0 |
| 0.8229166666666666 | 0 |
| 0.8236111111111111 | 0 |
| 0.8243055555555556 | 0 |
| 0.8250000000000001 | 0 |
| 0.8256944444444444 | 0 |
| 0.8263888888888888 | 0 |
| 0.8270833333333334 | 0 |
| 0.8277777777777778 | 0 |
| 0.8284722222222222 | 0 |
| 0.8291666666666666 | 0 |
| 0.8298611111111112 | 0 |
| 0.8305555555555556 | 0 |
| 0.8312499999999999 | 0 |
| 0.8319444444444444 | 0 |
| 0.8326388888888889 | 0 |
| 0.8333333333333334 | 0 |
| 0.8340277777777777 | 0 |
| 0.8347222222222223 | 0 |
| 0.8354166666666667 | 0 |
| 0.8361111111111111 | 0 |
| 0.8368055555555555 | 0 |
| 0.8375 | 0 |
| 0.8381944444444445 | 0 |
| 0.8388888888888889 | 0 |
| 0.8395833333333332 | 0 |
| 0.8402777777777778 | 0 |
| 0.8409722222222222 | 0 |
| 0.8416666666666667 | 0 |
| 0.842361111111111 | 0 |
| 0.8430555555555556 | 0 |
| 0.84375 | 0 |
| 0.8444444444444444 | 0 |
| 0.845138888888889 | 0 |
| 0.8458333333333333 | 0 |
| 0.8465277777777778 | 0 |
| 0.8472222222222222 | 0 |
| 0.8479166666666668 | 0 |
| 0.8486111111111111 | 0 |
| 0.8493055555555555 | 0 |
| 0.85 | 0 |
| 0.8506944444444445 | 0 |
| 0.8513888888888889 | 0 |
| 0.8520833333333333 | 0 |
| 0.8527777777777777 | 0 |
| 0.8534722222222223 | 0 |
| 0.8541666666666666 | 0 |
| 0.8548611111111111 | 0 |
| 0.8555555555555556 | 0 |
| 0.8562500000000001 | 0 |
| 0.8569444444444444 | 0 |
| 0.8576388888888888 | 0 |
| 0.8583333333333334 | 0 |
| 0.8590277777777778 | 0 |
| 0.8597222222222222 | 0 |
| 0.8604166666666666 | 0 |
| 0.8611111111111112 | 0 |
| 0.8618055555555556 | 0 |
| 0.8624999999999999 | 0 |
| 0.8631944444444444 | 0 |
| 0.8638888888888889 | 0 |
| 0.8645833333333334 | 0 |
| 0.8652777777777777 | 0 |
| 0.8659722222222223 | 0 |
| 0.8666666666666667 | 0 |
| 0.8673611111111111 | 0 |
| 0.8680555555555555 | 0 |
| 0.86875 | 0 |
| 0.8694444444444445 | 0 |
| 0.8701388888888889 | 0 |
| 0.8708333333333332 | 0 |
| 0.8715277777777778 | 0 |
| 0.8722222222222222 | 0 |
| 0.8729166666666667 | 0 |
| 0.873611111111111 | 0 |
| 0.8743055555555556 | 0 |
| 0.875 | 0 |
| 0.8756944444444444 | 0 |
| 0.876388888888889 | 0 |
| 0.8770833333333333 | 0 |
| 0.8777777777777778 | 0 |
| 0.8784722222222222 | 0 |
| 0.8791666666666668 | 0 |
| 0.8798611111111111 | 0 |
| 0.8805555555555555 | 0 |
| 0.88125 | 0 |
| 0.8819444444444445 | 0 |
| 0.8826388888888889 | 0 |
| 0.8833333333333333 | 0 |
| 0.8840277777777777 | 0 |
| 0.8847222222222223 | 0 |
| 0.8854166666666666 | 0 |
| 0.8861111111111111 | 0 |
| 0.8868055555555556 | 0 |
| 0.8875000000000001 | 0 |
| 0.8881944444444444 | 0 |
| 0.8888888888888888 | 0 |
| 0.8895833333333334 | 0 |
| 0.8902777777777778 | 0 |
| 0.8909722222222222 | 0 |
| 0.8916666666666666 | 0 |
| 0.8923611111111112 | 0 |
| 0.8930555555555556 | 0 |
| 0.8937499999999999 | 0 |
| 0.8944444444444444 | 0 |
| 0.8951388888888889 | 0 |
| 0.8958333333333334 | 0 |
| 0.8965277777777777 | 0 |
| 0.8972222222222223 | 0 |
| 0.8979166666666667 | 0 |
| 0.8986111111111111 | 0 |
| 0.8993055555555555 | 0 |
| 0.9 | 0 |
| 0.9006944444444445 | 0 |
| 0.9013888888888889 | 0 |
| 0.9020833333333332 | 0 |
| 0.9027777777777778 | 0 |
| 0.9034722222222222 | 0 |
| 0.9041666666666667 | 0 |
| 0.904861111111111 | 0 |
| 0.9055555555555556 | 0 |
| 0.90625 | 0 |
| 0.9069444444444444 | 0 |
| 0.907638888888889 | 0 |
| 0.9083333333333333 | 0 |
| 0.9090277777777778 | 0 |
| 0.9097222222222222 | 0 |
| 0.9104166666666668 | 0 |
| 0.9111111111111111 | 0 |
| 0.9118055555555555 | 0 |
| 0.9125 | 0 |
| 0.9131944444444445 | 0 |
| 0.9138888888888889 | 0 |
| 0.9145833333333333 | 0 |
| 0.9152777777777777 | 0 |
| 0.9159722222222223 | 0 |
| 0.9166666666666666 | 0 |
| 0.9173611111111111 | 0 |
| 0.9180555555555556 | 0 |
| 0.9187500000000001 | 0 |
| 0.9194444444444444 | 0 |
| 0.9201388888888888 | 0 |
| 0.9208333333333334 | 0 |
| 0.9215277777777778 | 0 |
| 0.9222222222222222 | 0 |
| 0.9229166666666666 | 0 |
| 0.9236111111111112 | 0 |
| 0.9243055555555556 | 0 |
| 0.9249999999999999 | 0 |
| 0.9256944444444444 | 0 |
| 0.9263888888888889 | 0 |
| 0.9270833333333334 | 0 |
| 0.9277777777777777 | 0 |
| 0.9284722222222223 | 0 |
| 0.9291666666666667 | 0 |
| 0.9298611111111111 | 0 |
| 0.9305555555555555 | 0 |
| 0.93125 | 0 |
| 0.9319444444444445 | 0 |
| 0.9326388888888889 | 0 |
| 0.9333333333333332 | 0 |
| 0.9340277777777778 | 0 |
| 0.9347222222222222 | 0 |
| 0.9354166666666667 | 0 |
| 0.936111111111111 | 0 |
| 0.9368055555555556 | 0 |
| 0.9375 | 0 |
| 0.9381944444444444 | 0 |
| 0.938888888888889 | 0 |
| 0.9395833333333333 | 0 |
| 0.9402777777777778 | 0 |
| 0.9409722222222222 | 0 |
| 0.9416666666666668 | 0 |
| 0.9423611111111111 | 0 |
| 0.9430555555555555 | 0 |
| 0.94375 | 0 |
| 0.9444444444444445 | 0 |
| 0.9451388888888889 | 0 |
| 0.9458333333333333 | 0 |
| 0.9465277777777777 | 0 |
| 0.9472222222222223 | 0 |
| 0.9479166666666666 | 0 |
| 0.9486111111111111 | 0 |
| 0.9493055555555556 | 0 |
| 0.9500000000000001 | 0 |
| 0.9506944444444444 | 0 |
| 0.9513888888888888 | 0 |
| 0.9520833333333334 | 0 |
| 0.9527777777777778 | 0 |
| 0.9534722222222222 | 0 |
| 0.9541666666666666 | 0 |
| 0.9548611111111112 | 0 |
| 0.9555555555555556 | 0 |
| 0.9562499999999999 | 0 |
| 0.9569444444444444 | 0 |
| 0.9576388888888889 | 0 |
| 0.9583333333333334 | 0 |
| 0.9590277777777777 | 0 |
| 0.9597222222222223 | 0 |
| 0.9604166666666667 | 0 |
| 0.9611111111111111 | 0 |
| 0.9618055555555555 | 0 |
| 0.9625 | 0 |
| 0.9631944444444445 | 0 |
| 0.9638888888888889 | 0 |
| 0.9645833333333332 | 0 |
| 0.9652777777777778 | 0 |
| 0.9659722222222222 | 0 |
| 0.9666666666666667 | 0 |
| 0.967361111111111 | 0 |
| 0.9680555555555556 | 0 |
| 0.96875 | 0 |
| 0.9694444444444444 | 0 |
| 0.970138888888889 | 0 |
| 0.9708333333333333 | 0 |
| 0.9715277777777778 | 0 |
| 0.9722222222222222 | 0 |
| 0.9729166666666668 | 0 |
| 0.9736111111111111 | 0 |
| 0.9743055555555555 | 0 |
| 0.975 | 0 |
| 0.9756944444444445 | 0 |
| 0.9763888888888889 | 0 |
| 0.9770833333333333 | 0 |
| 0.9777777777777777 | 0 |
| 0.9784722222222223 | 0 |
| 0.9791666666666666 | 0 |
| 0.9798611111111111 | 0 |
| 0.9805555555555556 | 0 |
| 0.9812500000000001 | 0 |
| 0.9819444444444444 | 0 |
| 0.9826388888888888 | 0 |
| 0.9833333333333334 | 0 |
| 0.9840277777777778 | 0 |
| 0.9847222222222222 | 0 |
| 0.9854166666666666 | 0 |
| 0.9861111111111112 | 0 |
| 0.9868055555555556 | 0 |
| 0.9874999999999999 | 0 |
| 0.9881944444444444 | 0 |
| 0.9888888888888889 | 0 |
| 0.9895833333333334 | 0 |
| 0.9902777777777777 | 0 |
| 0.9909722222222223 | 0 |
| 0.9916666666666667 | 0 |
| 0.9923611111111111 | 0 |
| 0.9930555555555555 | 0 |
| 0.99375 | 0 |
| 0.9944444444444445 | 0 |
| 0.9951388888888889 | 0 |
| 0.9958333333333332 | 0 |
| 0.9965277777777778 | 0 |
| 0.9972222222222222 | 0 |
| 0.9979166666666667 | 0 |
| 0.998611111111111 | 0 |
| 0.9993055555555556 | 0 |